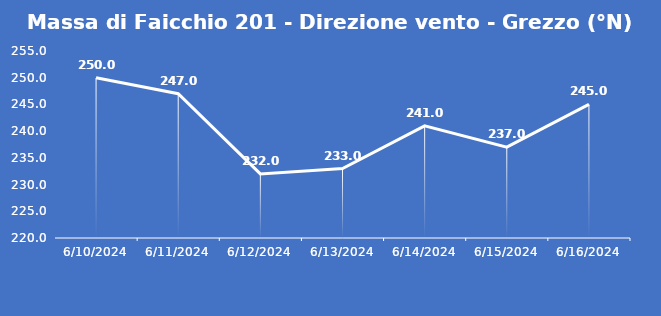
| Category | Massa di Faicchio 201 - Direzione vento - Grezzo (°N) |
|---|---|
| 6/10/24 | 250 |
| 6/11/24 | 247 |
| 6/12/24 | 232 |
| 6/13/24 | 233 |
| 6/14/24 | 241 |
| 6/15/24 | 237 |
| 6/16/24 | 245 |